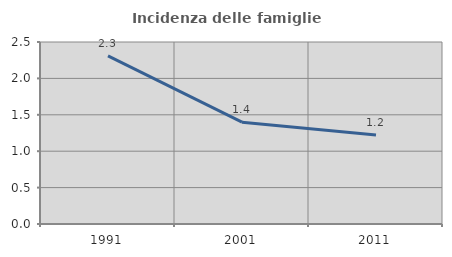
| Category | Incidenza delle famiglie numerose |
|---|---|
| 1991.0 | 2.31 |
| 2001.0 | 1.399 |
| 2011.0 | 1.221 |